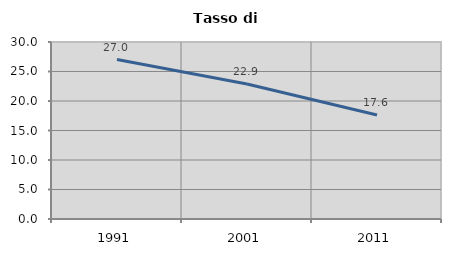
| Category | Tasso di disoccupazione   |
|---|---|
| 1991.0 | 27.018 |
| 2001.0 | 22.878 |
| 2011.0 | 17.621 |